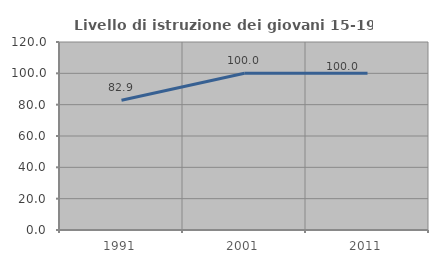
| Category | Livello di istruzione dei giovani 15-19 anni |
|---|---|
| 1991.0 | 82.857 |
| 2001.0 | 100 |
| 2011.0 | 100 |